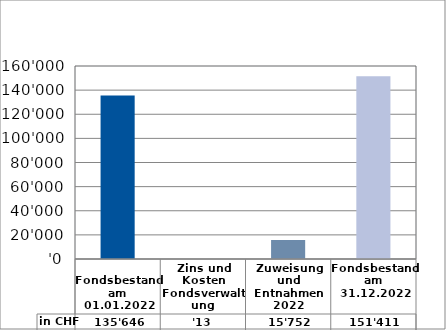
| Category | in CHF |
|---|---|
| 
Fondsbestand am 01.01.2022

 | 135646 |
| Zins und Kosten Fondsverwaltung | 13.22 |
| Zuweisung und Entnahmen 2022 | 15752 |
| Fondsbestand am 31.12.2022 | 151411.22 |